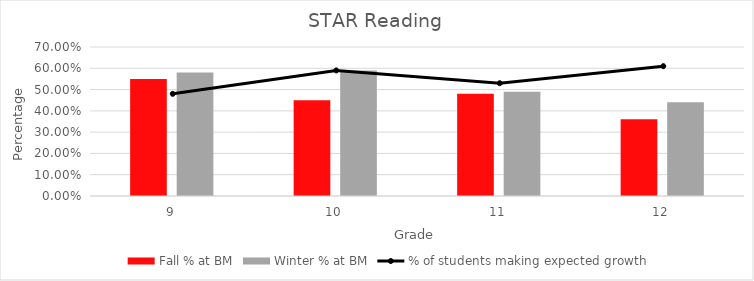
| Category | Fall % at BM | Winter % at BM |
|---|---|---|
| 9.0 | 0.55 | 0.58 |
| 10.0 | 0.45 | 0.59 |
| 11.0 | 0.48 | 0.49 |
| 12.0 | 0.36 | 0.44 |